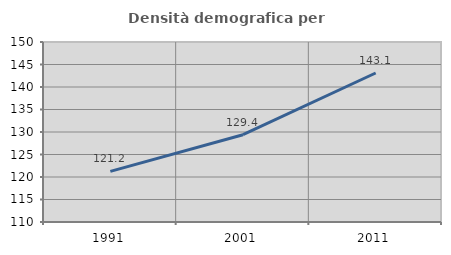
| Category | Densità demografica |
|---|---|
| 1991.0 | 121.243 |
| 2001.0 | 129.395 |
| 2011.0 | 143.11 |